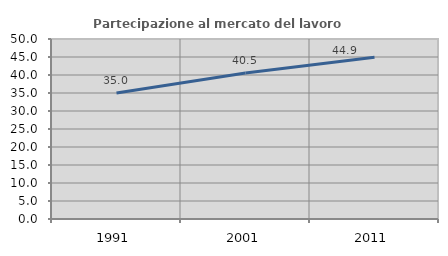
| Category | Partecipazione al mercato del lavoro  femminile |
|---|---|
| 1991.0 | 34.979 |
| 2001.0 | 40.547 |
| 2011.0 | 44.902 |